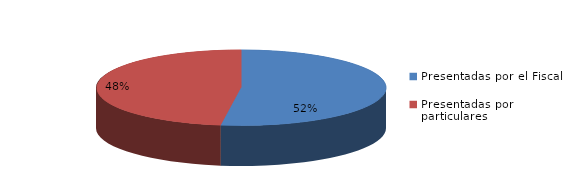
| Category | Series 0 |
|---|---|
| Presentadas por el Fiscal | 471 |
| Presentadas por particulares | 431 |